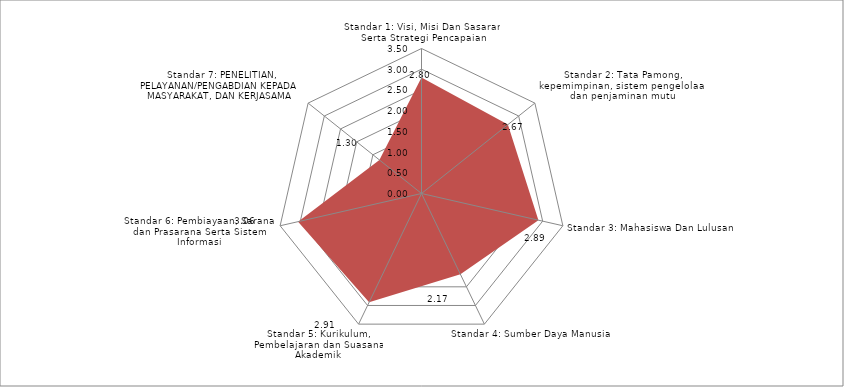
| Category | Series 0 |
|---|---|
| Standar 1: Visi, Misi Dan Sasaran Serta Strategi Pencapaian | 2.8 |
| Standar 2: Tata Pamong, kepemimpinan, sistem pengelolaan dan penjaminan mutu | 2.667 |
| Standar 3: Mahasiswa Dan Lulusan | 2.895 |
| Standar 4: Sumber Daya Manusia | 2.167 |
| Standar 5: Kurikulum, Pembelajaran dan Suasana Akademik | 2.914 |
| Standar 6: Pembiayaan, Sarana dan Prasarana Serta Sistem Informasi | 3.056 |
| Standar 7: PENELITIAN, PELAYANAN/PENGABDIAN KEPADA MASYARAKAT, DAN KERJASAMA | 1.3 |